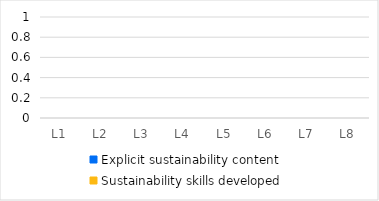
| Category | Explicit sustainability content | Sustainability skills developed |
|---|---|---|
| L1 | 0 | 0 |
| L2 | 0 | 0 |
| L3 | 0 | 0 |
| L4 | 0 | 0 |
| L5 | 0 | 0 |
| L6 | 0 | 0 |
| L7 | 0 | 0 |
| L8 | 0 | 0 |